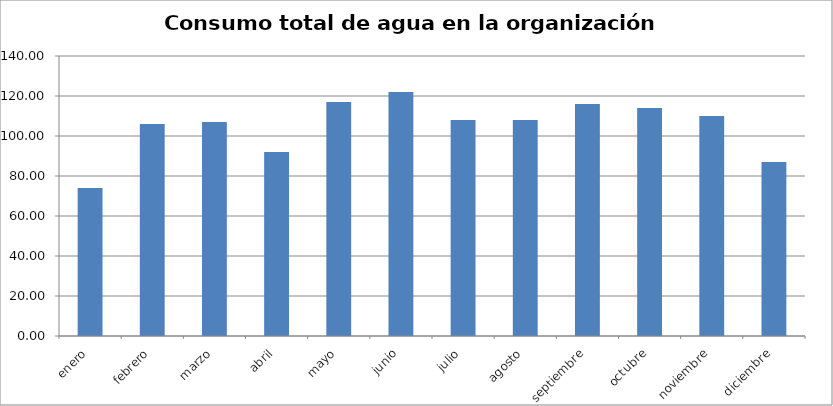
| Category | Series 0 |
|---|---|
| enero | 74 |
| febrero | 106 |
| marzo | 107 |
| abril | 92 |
| mayo | 117 |
| junio | 122 |
| julio | 108 |
| agosto | 108 |
| septiembre | 116 |
| octubre | 114 |
| noviembre | 110 |
| diciembre | 87 |